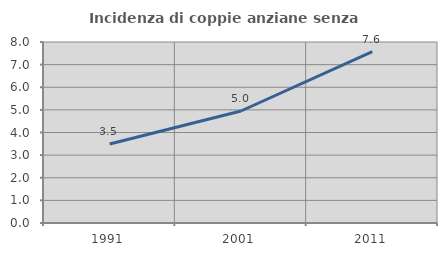
| Category | Incidenza di coppie anziane senza figli  |
|---|---|
| 1991.0 | 3.488 |
| 2001.0 | 4.95 |
| 2011.0 | 7.576 |